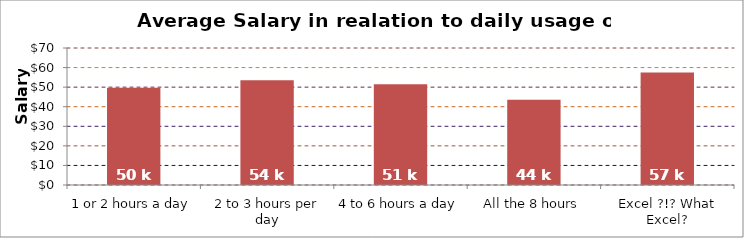
| Category | Total |
|---|---|
| 1 or 2 hours a day | 49726.376 |
| 2 to 3 hours per day | 53554.662 |
| 4 to 6 hours a day | 51423.251 |
| All the 8 hours | 43571.163 |
| Excel ?!? What Excel? | 57493.382 |